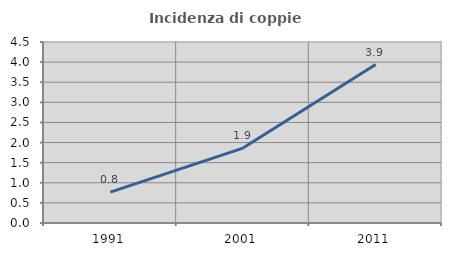
| Category | Incidenza di coppie miste |
|---|---|
| 1991.0 | 0.769 |
| 2001.0 | 1.863 |
| 2011.0 | 3.94 |